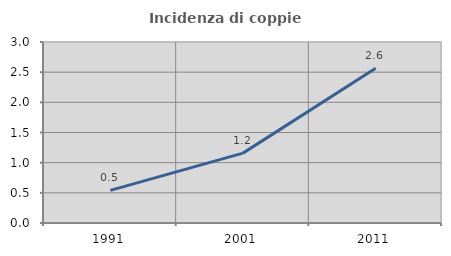
| Category | Incidenza di coppie miste |
|---|---|
| 1991.0 | 0.541 |
| 2001.0 | 1.158 |
| 2011.0 | 2.564 |